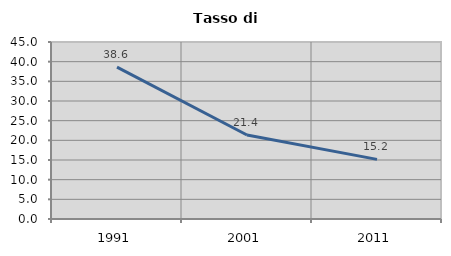
| Category | Tasso di disoccupazione   |
|---|---|
| 1991.0 | 38.624 |
| 2001.0 | 21.351 |
| 2011.0 | 15.156 |